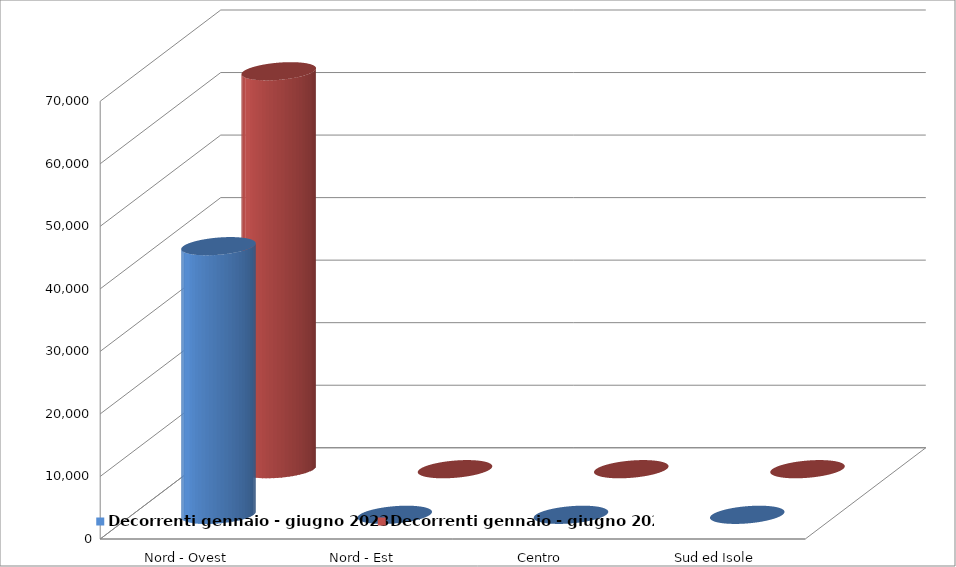
| Category | Decorrenti gennaio - giugno 2023 | Decorrenti gennaio - giugno 2022 |
|---|---|---|
| Nord - Ovest | 42955 | 63630 |
| Nord - Est | 0 | 0 |
| Centro | 0 | 0 |
| Sud ed Isole | 0 | 0 |